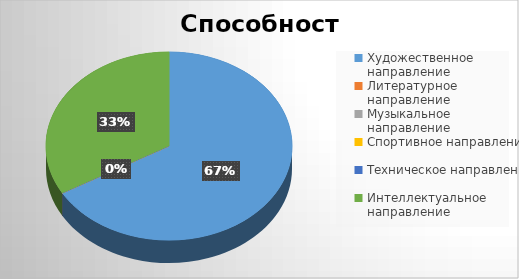
| Category | Series 0 |
|---|---|
| Художественное направление | 2 |
| Литературное направление | 0 |
| Музыкальное направление | 0 |
| Спортивное направление | 0 |
| Техническое направление | 0 |
| Интеллектуальное направление | 1 |